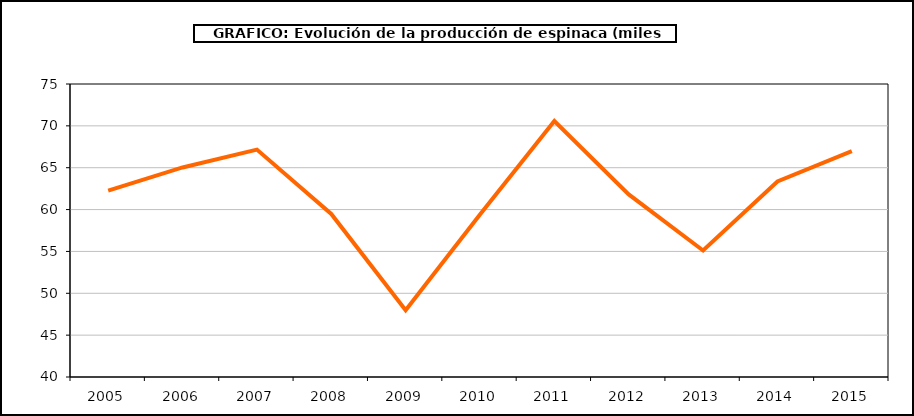
| Category | producción |
|---|---|
| 2005.0 | 62.262 |
| 2006.0 | 65.03 |
| 2007.0 | 67.167 |
| 2008.0 | 59.476 |
| 2009.0 | 47.983 |
| 2010.0 | 59.403 |
| 2011.0 | 70.571 |
| 2012.0 | 61.814 |
| 2013.0 | 55.11 |
| 2014.0 | 63.364 |
| 2015.0 | 66.989 |